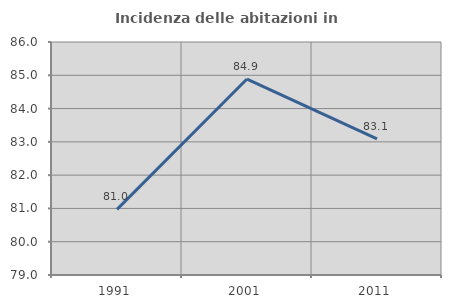
| Category | Incidenza delle abitazioni in proprietà  |
|---|---|
| 1991.0 | 80.97 |
| 2001.0 | 84.887 |
| 2011.0 | 83.092 |